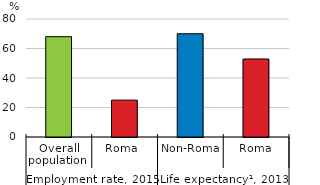
| Category | Series 0 |
|---|---|
| 0 | 68 |
| 1 | 25 |
| 2 | 70 |
| 3 | 52.9 |